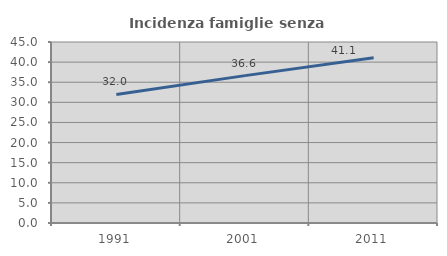
| Category | Incidenza famiglie senza nuclei |
|---|---|
| 1991.0 | 31.959 |
| 2001.0 | 36.638 |
| 2011.0 | 41.071 |